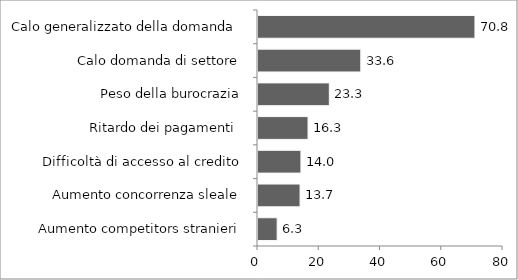
| Category | VAL |
|---|---|
| Aumento competitors stranieri | 6.254 |
| Aumento concorrenza sleale | 13.729 |
| Difficoltà di accesso al credito | 14.012 |
| Ritardo dei pagamenti  | 16.336 |
| Peso della burocrazia | 23.286 |
| Calo domanda di settore | 33.561 |
| Calo generalizzato della domanda  | 70.839 |